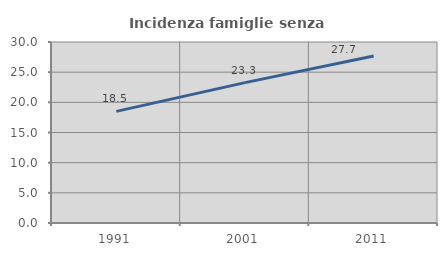
| Category | Incidenza famiglie senza nuclei |
|---|---|
| 1991.0 | 18.505 |
| 2001.0 | 23.262 |
| 2011.0 | 27.677 |